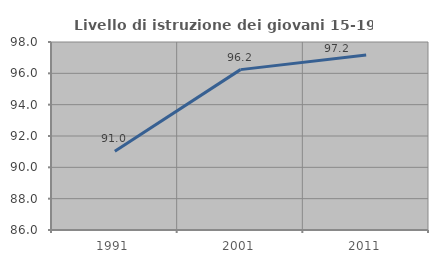
| Category | Livello di istruzione dei giovani 15-19 anni |
|---|---|
| 1991.0 | 91.027 |
| 2001.0 | 96.237 |
| 2011.0 | 97.164 |